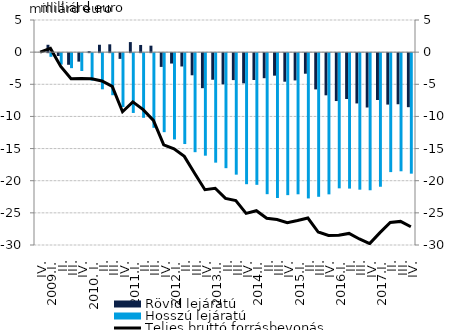
| Category | Rövid lejáratú | Hosszú lejáratú |
|---|---|---|
| IV. | 0 | 0 |
| 2009.I. | 1.146 | -0.569 |
| II. | -0.45 | -1.774 |
| III. | -1.812 | -2.335 |
| IV. | -1.32 | -2.774 |
| 2010. I. | 0.151 | -4.276 |
| II. | 1.149 | -5.624 |
| III. | 1.219 | -6.544 |
| IV. | -0.89 | -8.382 |
| 2011.I. | 1.566 | -9.306 |
| II. | 1.117 | -10.062 |
| III. | 1.005 | -11.613 |
| IV. | -2.141 | -12.295 |
| 2012.I. | -1.618 | -13.424 |
| II. | -2.075 | -14.139 |
| III. | -3.443 | -15.407 |
| IV. | -5.45 | -15.951 |
| 2013.I. | -4.137 | -17.035 |
| II. | -4.847 | -17.895 |
| III. | -4.192 | -18.901 |
| IV. | -4.699 | -20.387 |
| 2014.I. | -4.182 | -20.484 |
| II. | -3.898 | -21.94 |
| III. | -3.502 | -22.537 |
| IV. | -4.443 | -22.089 |
| 2015.I. | -4.243 | -21.956 |
| II. | -3.2 | -22.6 |
| III. | -5.638 | -22.343 |
| IV. | -6.561 | -21.966 |
| 2016.I. | -7.452 | -21.031 |
| II. | -7.132 | -21.07 |
| III. | -7.825 | -21.238 |
| IV. | -8.457 | -21.33 |
| 2017.I. | -7.289 | -20.783 |
| II. | -8.002 | -18.505 |
| III. | -7.951 | -18.377 |
| IV. | -8.407 | -18.747 |